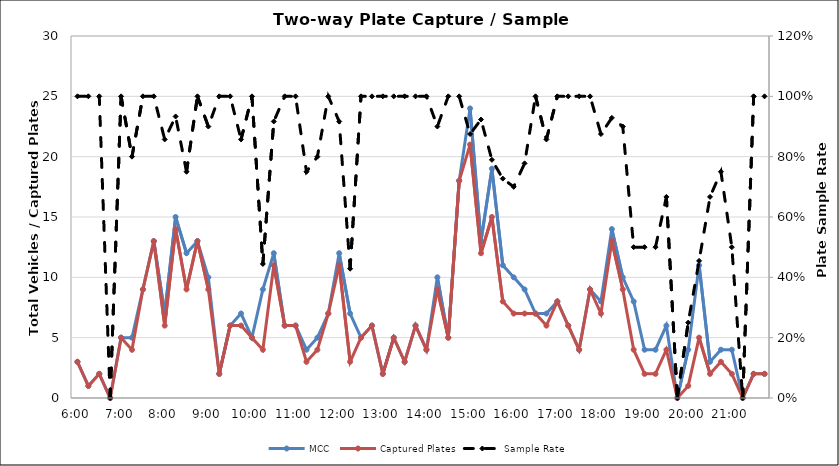
| Category | MCC | Captured Plates |
|---|---|---|
| 0.25 | 3 | 3 |
| 0.260416666666667 | 1 | 1 |
| 0.270833333333333 | 2 | 2 |
| 0.28125 | 0 | 0 |
| 0.291666666666667 | 5 | 5 |
| 0.302083333333333 | 5 | 4 |
| 0.3125 | 9 | 9 |
| 0.322916666666667 | 13 | 13 |
| 0.333333333333333 | 7 | 6 |
| 0.34375 | 15 | 14 |
| 0.354166666666667 | 12 | 9 |
| 0.364583333333333 | 13 | 13 |
| 0.375 | 10 | 9 |
| 0.385416666666667 | 2 | 2 |
| 0.395833333333333 | 6 | 6 |
| 0.40625 | 7 | 6 |
| 0.416666666666667 | 5 | 5 |
| 0.427083333333333 | 9 | 4 |
| 0.4375 | 12 | 11 |
| 0.447916666666667 | 6 | 6 |
| 0.458333333333333 | 6 | 6 |
| 0.46875 | 4 | 3 |
| 0.479166666666667 | 5 | 4 |
| 0.489583333333333 | 7 | 7 |
| 0.5 | 12 | 11 |
| 0.510416666666667 | 7 | 3 |
| 0.520833333333333 | 5 | 5 |
| 0.53125 | 6 | 6 |
| 0.541666666666667 | 2 | 2 |
| 0.552083333333333 | 5 | 5 |
| 0.5625 | 3 | 3 |
| 0.572916666666667 | 6 | 6 |
| 0.583333333333333 | 4 | 4 |
| 0.59375 | 10 | 9 |
| 0.604166666666667 | 5 | 5 |
| 0.614583333333333 | 18 | 18 |
| 0.625 | 24 | 21 |
| 0.635416666666667 | 13 | 12 |
| 0.645833333333333 | 19 | 15 |
| 0.65625 | 11 | 8 |
| 0.666666666666667 | 10 | 7 |
| 0.677083333333333 | 9 | 7 |
| 0.6875 | 7 | 7 |
| 0.697916666666667 | 7 | 6 |
| 0.708333333333333 | 8 | 8 |
| 0.71875 | 6 | 6 |
| 0.729166666666667 | 4 | 4 |
| 0.739583333333333 | 9 | 9 |
| 0.75 | 8 | 7 |
| 0.760416666666667 | 14 | 13 |
| 0.770833333333333 | 10 | 9 |
| 0.78125 | 8 | 4 |
| 0.791666666666667 | 4 | 2 |
| 0.802083333333333 | 4 | 2 |
| 0.8125 | 6 | 4 |
| 0.822916666666667 | 0 | 0 |
| 0.833333333333333 | 4 | 1 |
| 0.84375 | 11 | 5 |
| 0.854166666666667 | 3 | 2 |
| 0.864583333333333 | 4 | 3 |
| 0.875 | 4 | 2 |
| 0.885416666666667 | 0 | 0 |
| 0.895833333333333 | 2 | 2 |
| 0.90625 | 2 | 2 |